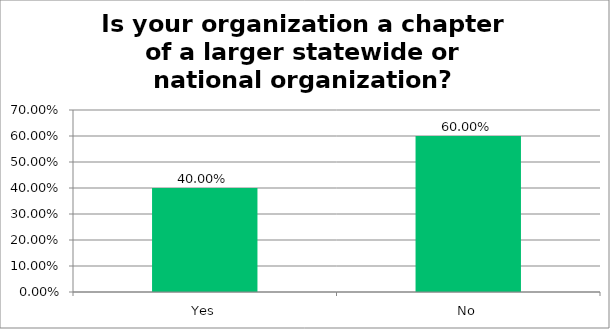
| Category | Responses |
|---|---|
| Yes | 0.4 |
| No | 0.6 |